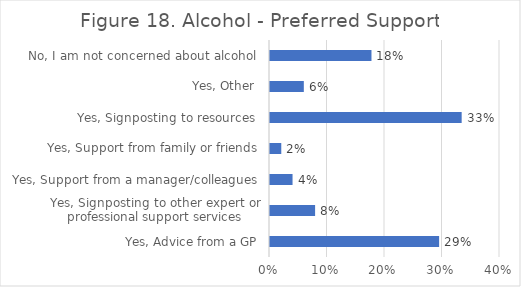
| Category | Series 0 |
|---|---|
| Yes, Advice from a GP | 0.294 |
| Yes, Signposting to other expert or professional support services | 0.078 |
| Yes, Support from a manager/colleagues | 0.039 |
| Yes, Support from family or friends | 0.02 |
| Yes, Signposting to resources  | 0.333 |
| Yes, Other  | 0.059 |
| No, I am not concerned about alcohol  | 0.176 |